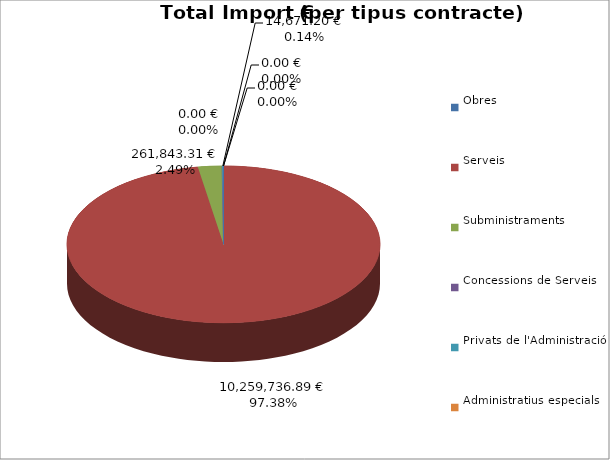
| Category | Total preu
(amb IVA) |
|---|---|
| Obres | 0 |
| Serveis | 10259736.89 |
| Subministraments | 261843.31 |
| Concessions de Serveis | 0 |
| Privats de l'Administració | 14671.2 |
| Administratius especials | 0 |